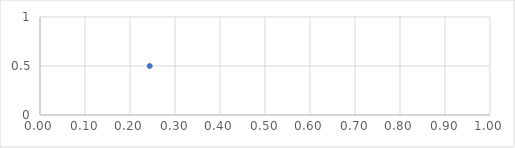
| Category | Series 0 |
|---|---|
| 0.243828494222863 | 0.5 |